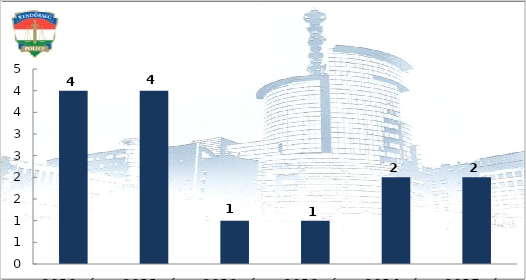
| Category | Halálos közúti közlekedési balesetek |
|---|---|
| 2010. év | 4 |
| 2011. év | 4 |
| 2012. év | 1 |
| 2013. év | 1 |
| 2014. év | 2 |
| 2015. év | 2 |